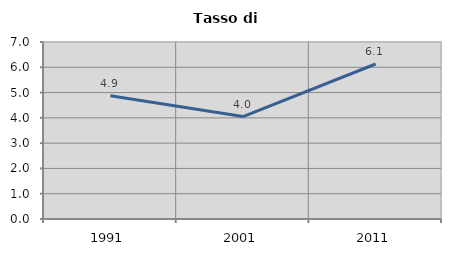
| Category | Tasso di disoccupazione   |
|---|---|
| 1991.0 | 4.873 |
| 2001.0 | 4.049 |
| 2011.0 | 6.13 |